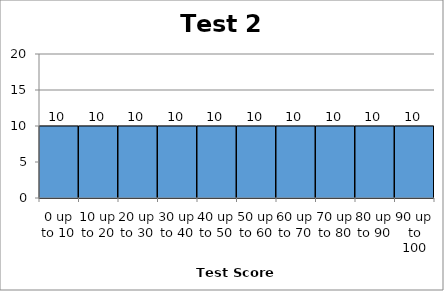
| Category | Frequency |
|---|---|
| 0 up to 10 | 10 |
| 10 up to 20 | 10 |
| 20 up to 30 | 10 |
| 30 up to 40 | 10 |
| 40 up to 50 | 10 |
| 50 up to 60 | 10 |
| 60 up to 70 | 10 |
| 70 up to 80 | 10 |
| 80 up to 90 | 10 |
| 90 up to 100 | 10 |